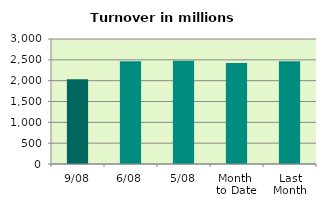
| Category | Series 0 |
|---|---|
| 9/08 | 2033.444 |
| 6/08 | 2467.104 |
| 5/08 | 2478.163 |
| Month 
to Date | 2426.315 |
| Last
Month | 2466.495 |